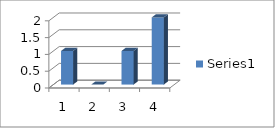
| Category | Series 0 |
|---|---|
| 0 | 1 |
| 1 | 0 |
| 2 | 1 |
| 3 | 2 |